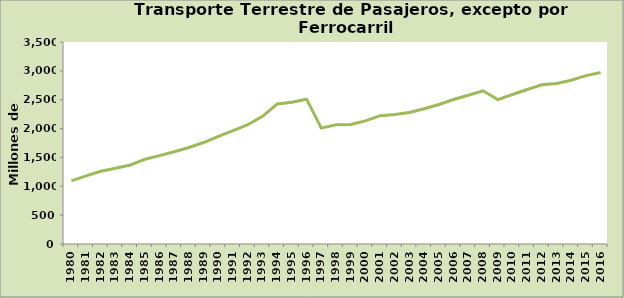
| Category | Series 0 |
|---|---|
| 1980.0 | 1094 |
| 1981.0 | 1180 |
| 1982.0 | 1261 |
| 1983.0 | 1312 |
| 1984.0 | 1368 |
| 1985.0 | 1468 |
| 1986.0 | 1531 |
| 1987.0 | 1599 |
| 1988.0 | 1673 |
| 1989.0 | 1758 |
| 1990.0 | 1865 |
| 1991.0 | 1965 |
| 1992.0 | 2066 |
| 1993.0 | 2212 |
| 1994.0 | 2426 |
| 1995.0 | 2457 |
| 1996.0 | 2509 |
| 1997.0 | 2008 |
| 1998.0 | 2065 |
| 1999.0 | 2070 |
| 2000.0 | 2134 |
| 2001.0 | 2224 |
| 2002.0 | 2245 |
| 2003.0 | 2279 |
| 2004.0 | 2344 |
| 2005.0 | 2418 |
| 2006.0 | 2503 |
| 2007.0 | 2578 |
| 2008.0 | 2655 |
| 2009.0 | 2501 |
| 2010.0 | 2591 |
| 2011.0 | 2677 |
| 2012.0 | 2758 |
| 2013.0 | 2781 |
| 2014.0 | 2836.795 |
| 2015.0 | 2918 |
| 2016.0 | 2970.86 |